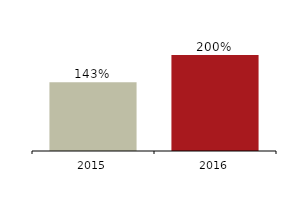
| Category | Liquidity coverage ratio (LCR) - All currencies |
|---|---|
| 2016.0 | 2 |
| 2015.0 | 1.43 |